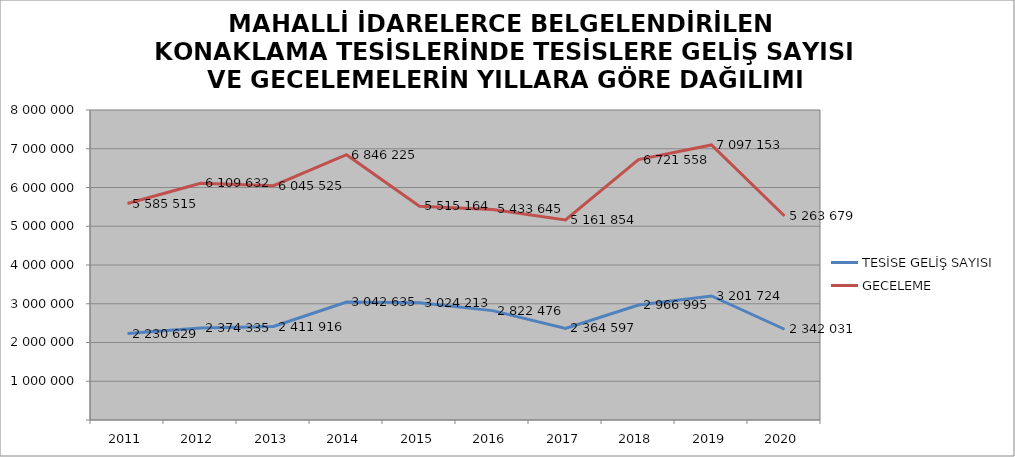
| Category | TESİSE GELİŞ SAYISI | GECELEME |
|---|---|---|
| 2011 | 2230629 | 5585515 |
| 2012 | 2374335 | 6109632 |
| 2013 | 2411916 | 6045525 |
| 2014 | 3042635 | 6846225 |
| 2015 | 3024213 | 5515164 |
| 2016 | 2822476 | 5433645 |
| 2017 | 2364597 | 5161854 |
| 2018 | 2966995 | 6721558 |
| 2019 | 3201724 | 7097153 |
| 2020 | 2342031 | 5263679 |